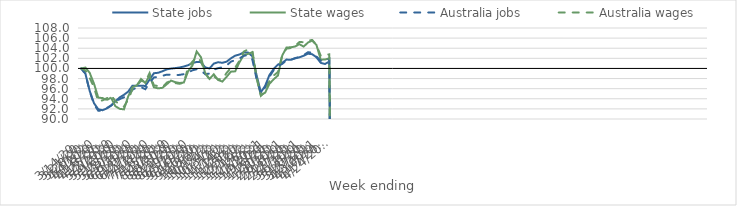
| Category | State jobs | State wages | Australia jobs | Australia wages |
|---|---|---|---|---|
| 14/03/2020 | 100 | 100 | 100 | 100 |
| 21/03/2020 | 98.972 | 100.169 | 98.971 | 99.607 |
| 28/03/2020 | 95.55 | 99.129 | 95.468 | 98.119 |
| 04/04/2020 | 93.129 | 97.002 | 92.921 | 96.261 |
| 11/04/2020 | 91.928 | 94.229 | 91.648 | 93.491 |
| 18/04/2020 | 91.74 | 94.142 | 91.631 | 93.695 |
| 25/04/2020 | 92.09 | 93.749 | 92.161 | 94.112 |
| 02/05/2020 | 92.666 | 94.237 | 92.658 | 94.685 |
| 09/05/2020 | 93.482 | 92.536 | 93.342 | 93.574 |
| 16/05/2020 | 94.276 | 92.011 | 93.935 | 92.809 |
| 23/05/2020 | 94.777 | 91.907 | 94.29 | 92.465 |
| 30/05/2020 | 95.427 | 94.47 | 94.796 | 93.818 |
| 06/06/2020 | 96.594 | 96.289 | 95.779 | 95.924 |
| 13/06/2020 | 96.601 | 96.656 | 96.278 | 96.597 |
| 20/06/2020 | 96.57 | 97.907 | 96.293 | 97.571 |
| 27/06/2020 | 96.543 | 97.13 | 95.898 | 97.324 |
| 04/07/2020 | 97.802 | 98.583 | 97.132 | 99.089 |
| 11/07/2020 | 99.053 | 96.263 | 98.221 | 96.668 |
| 18/07/2020 | 99.143 | 96.061 | 98.324 | 96.5 |
| 25/07/2020 | 99.446 | 96.167 | 98.548 | 96.312 |
| 01/08/2020 | 99.813 | 96.865 | 98.77 | 97.181 |
| 08/08/2020 | 99.972 | 97.597 | 98.766 | 97.601 |
| 15/08/2020 | 100.067 | 97.29 | 98.672 | 97.108 |
| 22/08/2020 | 100.187 | 97.127 | 98.73 | 96.964 |
| 29/08/2020 | 100.383 | 97.215 | 98.866 | 97.198 |
| 05/09/2020 | 100.638 | 99.437 | 99.166 | 100.215 |
| 12/09/2020 | 101.065 | 100.563 | 99.638 | 101.349 |
| 19/09/2020 | 101.283 | 103.358 | 99.835 | 102.253 |
| 26/09/2020 | 101.239 | 102.234 | 99.64 | 101.42 |
| 03/10/2020 | 100.199 | 99.018 | 98.855 | 99.138 |
| 10/10/2020 | 99.999 | 97.919 | 98.997 | 97.834 |
| 17/10/2020 | 100.958 | 98.839 | 99.767 | 98.431 |
| 24/10/2020 | 101.232 | 97.725 | 100.05 | 97.835 |
| 31/10/2020 | 101.116 | 97.405 | 100.228 | 97.89 |
| 07/11/2020 | 101.342 | 98.347 | 100.597 | 99.112 |
| 14/11/2020 | 102.001 | 99.366 | 101.334 | 100.12 |
| 21/11/2020 | 102.526 | 99.429 | 101.652 | 100.166 |
| 28/11/2020 | 102.759 | 101.21 | 101.968 | 101.522 |
| 05/12/2020 | 103.175 | 102.639 | 102.515 | 103.324 |
| 12/12/2020 | 103.163 | 102.88 | 102.583 | 103.755 |
| 19/12/2020 | 102.412 | 103.194 | 101.771 | 103.629 |
| 26/12/2020 | 98.665 | 98.183 | 97.972 | 98.159 |
| 02/01/2021 | 95.282 | 94.72 | 95.021 | 94.58 |
| 09/01/2021 | 96.545 | 95.206 | 96.246 | 95.443 |
| 16/01/2021 | 98.689 | 96.964 | 98.354 | 97.531 |
| 23/01/2021 | 99.902 | 97.853 | 99.666 | 98.597 |
| 30/01/2021 | 100.783 | 98.614 | 100.48 | 99.293 |
| 06/02/2021 | 101.116 | 102.566 | 100.907 | 102.696 |
| 13/02/2021 | 101.756 | 104.139 | 101.592 | 103.915 |
| 20/02/2021 | 101.702 | 104.186 | 101.718 | 104.04 |
| 27/02/2021 | 101.985 | 104.338 | 102.048 | 104.48 |
| 06/03/2021 | 102.204 | 104.799 | 102.273 | 105.217 |
| 13/03/2021 | 102.503 | 104.318 | 102.625 | 105.198 |
| 20/03/2021 | 102.909 | 105.117 | 103.203 | 105.516 |
| 27/03/2021 | 102.817 | 105.52 | 103.136 | 105.634 |
| 03/04/2021 | 102.207 | 104.631 | 102.34 | 104.641 |
| 10/04/2021 | 101.101 | 101.728 | 101.508 | 102.484 |
| 17/04/2021 | 100.884 | 101.767 | 101.424 | 102.692 |
| 24/04/2021 | 101.364 | 101.998 | 101.89 | 102.787 |